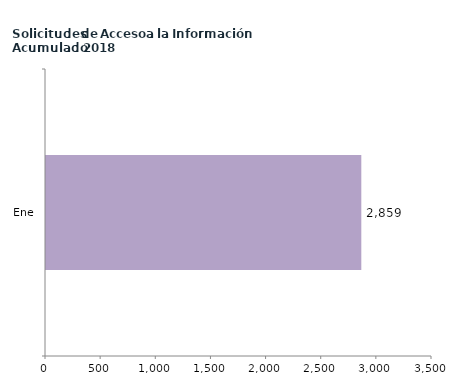
| Category | Series 0 |
|---|---|
| Ene | 2859 |